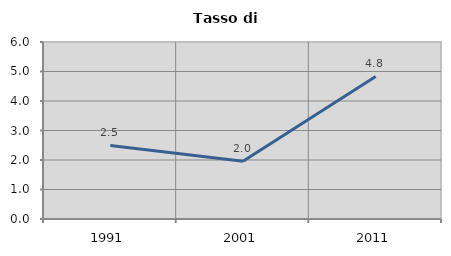
| Category | Tasso di disoccupazione   |
|---|---|
| 1991.0 | 2.492 |
| 2001.0 | 1.955 |
| 2011.0 | 4.834 |